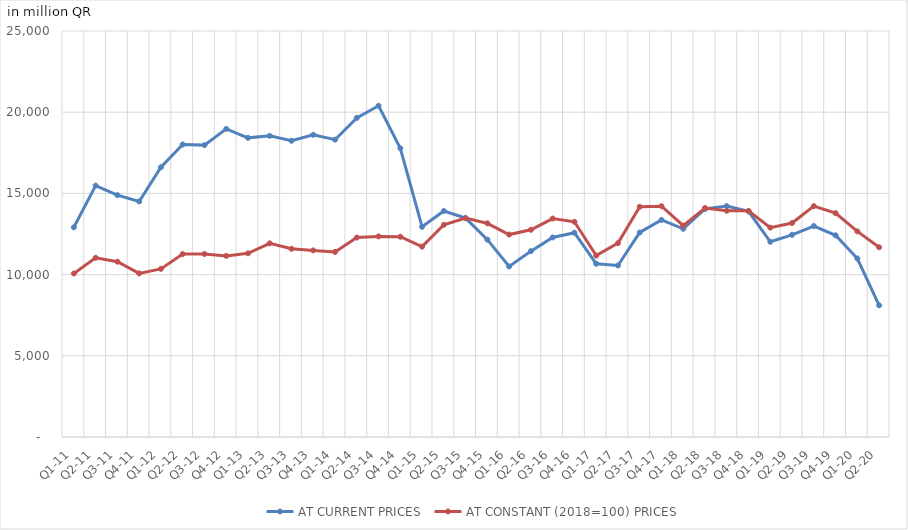
| Category | AT CURRENT PRICES | AT CONSTANT (2018=100) PRICES |
|---|---|---|
| Q1-11 | 12912.907 | 10068.869 |
| Q2-11 | 15479.199 | 11036.204 |
| Q3-11 | 14892.66 | 10797.142 |
| Q4-11 | 14504.238 | 10074.111 |
| Q1-12 | 16614.74 | 10353.078 |
| Q2-12 | 18012.764 | 11263.356 |
| Q3-12 | 17973.109 | 11268.506 |
| Q4-12 | 18970.409 | 11151.958 |
| Q1-13 | 18420.268 | 11311.118 |
| Q2-13 | 18546.036 | 11925.266 |
| Q3-13 | 18243.599 | 11590.597 |
| Q4-13 | 18609.796 | 11489.62 |
| Q1-14 | 18307.172 | 11397.125 |
| Q2-14 | 19651.76 | 12281.462 |
| Q3-14 | 20397.095 | 12353.163 |
| Q4-14 | 17776.805 | 12331.209 |
| Q1-15 | 12941.758 | 11720.853 |
| Q2-15 | 13914.764 | 13068.79 |
| Q3-15 | 13480.342 | 13476.366 |
| Q4-15 | 12151.815 | 13157.091 |
| Q1-16 | 10501.506 | 12465.232 |
| Q2-16 | 11444.689 | 12758.677 |
| Q3-16 | 12289.243 | 13451.479 |
| Q4-16 | 12578.39 | 13251.377 |
| Q1-17 | 10668.877 | 11173.828 |
| Q2-17 | 10560.003 | 11938.003 |
| Q3-17 | 12593.519 | 14175.115 |
| Q4-17 | 13366.273 | 14212.124 |
| Q1-18 | 12820.693 | 13015.892 |
| Q2-18 | 14040.866 | 14101.275 |
| Q3-18 | 14220.551 | 13929.711 |
| Q4-18 | 13889.452 | 13924.683 |
| Q1-19 | 12021.432 | 12893.311 |
| Q2-19 | 12449.429 | 13177.366 |
| Q3-19 | 12992.238 | 14214.263 |
| Q4-19 | 12418.423 | 13781.141 |
| Q1-20 | 10990.018 | 12663.57 |
| Q2-20 | 8107.631 | 11685.106 |